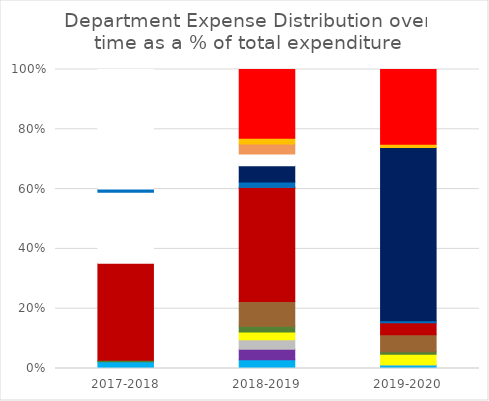
| Category | 16,000 Strong | Academic Affairs | City Affairs | Communications Department | Environmental Affairs | Events Department | Executive Board | Finance Department | Judicial Commission | Mental Health Committee | NATSG | Recruitment Department | SEC | Senate | Social Advocacy | VP of Internal Affairs |
|---|---|---|---|---|---|---|---|---|---|---|---|---|---|---|---|---|
| 2017-2018 | 1700.47 | 0 | 0 | 0 | 382.97 | 0 | 24827 | 18171.92 | 0 | 807.26 | 30467.1 | 0 | 88 | 0 | 0 | 0 |
| 2018-2019 | 1793.29 | 2091.53 | 1924.89 | 1562.46 | 1197.88 | 4994.82 | 23078.65 | 0 | 64.95 | 1045.56 | 0 | 3315.39 | 2377.85 | 2002.68 | 1175.81 | 13913.31 |
| 2019-2020 | 156.21 | 0 | 10.5 | 490.54 | 104.7 | 779.32 | 549.97 | 0 | 0 | 93.75 | 0 | 7918.5 | 0 | 0 | 151.67 | 3421.82 |